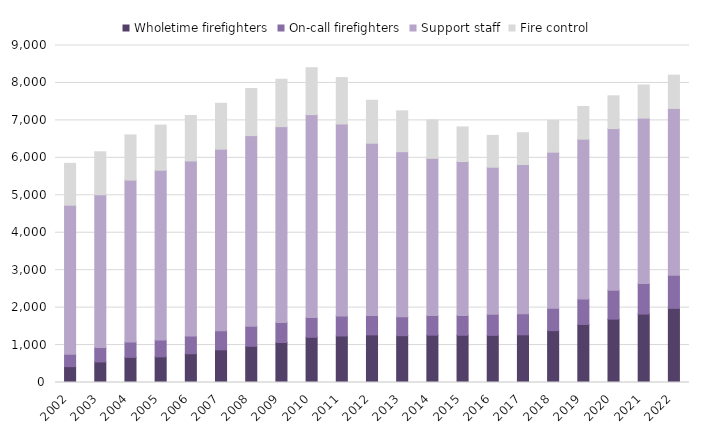
| Category | Wholetime firefighters | On-call firefighters | Support staff | Fire control |
|---|---|---|---|---|
| 2002.0 | 424 | 329 | 3981 | 1118 |
| 2003.0 | 549 | 389 | 4075 | 1148 |
| 2004.0 | 671 | 410 | 4325 | 1206 |
| 2005.0 | 685 | 447 | 4537 | 1206 |
| 2006.0 | 768 | 471 | 4678 | 1215 |
| 2007.0 | 873 | 509 | 4849 | 1226 |
| 2008.0 | 967 | 535 | 5091 | 1258 |
| 2009.0 | 1068 | 537 | 5228 | 1266 |
| 2010.0 | 1208 | 525 | 5421 | 1253 |
| 2011.0 | 1242 | 536 | 5126 | 1239 |
| 2012.0 | 1273 | 517 | 4601 | 1146 |
| 2013.0 | 1251 | 504 | 4409 | 1091 |
| 2014.0 | 1264 | 523 | 4199 | 1026 |
| 2015.0 | 1262 | 525 | 4115 | 923 |
| 2016.0 | 1259 | 565 | 3926 | 850 |
| 2017.0 | 1274 | 559 | 3988 | 850 |
| 2018.0 | 1386 | 594 | 4171 | 848 |
| 2019.0 | 1550 | 681 | 4267 | 873 |
| 2020.0 | 1692 | 769 | 4320 | 876 |
| 2021.0 | 1828 | 816 | 4416 | 885 |
| 2022.0 | 1980 | 882 | 4457 | 888 |